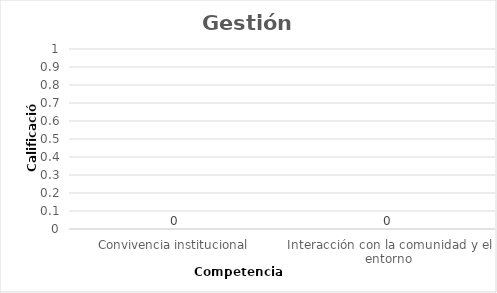
| Category | Series 0 |
|---|---|
| Convivencia institucional | 0 |
| Interacción con la comunidad y el entorno | 0 |